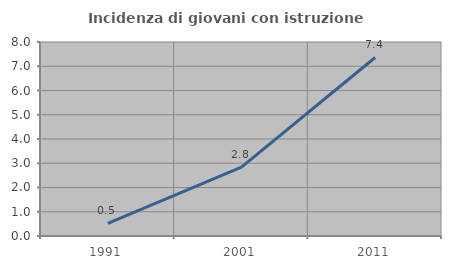
| Category | Incidenza di giovani con istruzione universitaria |
|---|---|
| 1991.0 | 0.524 |
| 2001.0 | 2.844 |
| 2011.0 | 7.362 |